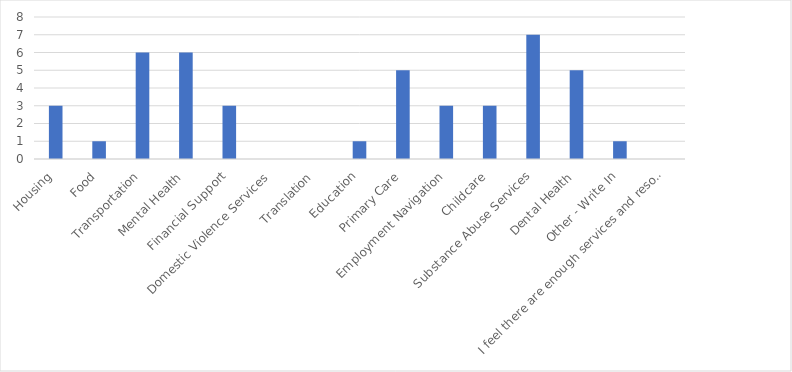
| Category | Number of Responses |
|---|---|
| Housing | 3 |
| Food | 1 |
| Transportation | 6 |
| Mental Health | 6 |
| Financial Support | 3 |
| Domestic Violence Services | 0 |
| Translation | 0 |
| Education | 1 |
| Primary Care | 5 |
| Employment Navigation | 3 |
| Childcare | 3 |
| Substance Abuse Services | 7 |
| Dental Health | 5 |
| Other - Write In | 1 |
| I feel there are enough services and resources to refer my patients/clients to. | 0 |